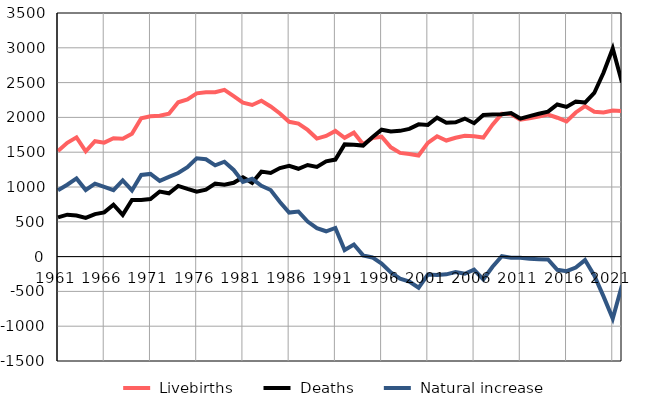
| Category |  Livebirths |  Deaths |  Natural increase |
|---|---|---|---|
| 1961.0 | 1517 | 563 | 954 |
| 1962.0 | 1634 | 602 | 1032 |
| 1963.0 | 1713 | 590 | 1123 |
| 1964.0 | 1512 | 555 | 957 |
| 1965.0 | 1658 | 610 | 1048 |
| 1966.0 | 1637 | 635 | 1002 |
| 1967.0 | 1700 | 745 | 955 |
| 1968.0 | 1694 | 600 | 1094 |
| 1969.0 | 1765 | 814 | 951 |
| 1970.0 | 1987 | 814 | 1173 |
| 1971.0 | 2015 | 827 | 1188 |
| 1972.0 | 2023 | 935 | 1088 |
| 1973.0 | 2054 | 909 | 1145 |
| 1974.0 | 2217 | 1016 | 1201 |
| 1975.0 | 2257 | 972 | 1285 |
| 1976.0 | 2345 | 933 | 1412 |
| 1977.0 | 2361 | 962 | 1399 |
| 1978.0 | 2361 | 1050 | 1311 |
| 1979.0 | 2395 | 1032 | 1363 |
| 1980.0 | 2305 | 1060 | 1245 |
| 1981.0 | 2212 | 1140 | 1072 |
| 1982.0 | 2178 | 1060 | 1118 |
| 1983.0 | 2239 | 1221 | 1018 |
| 1984.0 | 2157 | 1201 | 956 |
| 1985.0 | 2057 | 1272 | 785 |
| 1986.0 | 1937 | 1304 | 633 |
| 1987.0 | 1910 | 1262 | 648 |
| 1988.0 | 1820 | 1316 | 504 |
| 1989.0 | 1696 | 1288 | 408 |
| 1990.0 | 1733 | 1369 | 364 |
| 1991.0 | 1806 | 1394 | 412 |
| 1992.0 | 1707 | 1612 | 95 |
| 1993.0 | 1781 | 1607 | 174 |
| 1994.0 | 1613 | 1595 | 18 |
| 1995.0 | 1702 | 1714 | -12 |
| 1996.0 | 1723 | 1823 | -100 |
| 1997.0 | 1570 | 1799 | -229 |
| 1998.0 | 1490 | 1807 | -317 |
| 1999.0 | 1475 | 1835 | -360 |
| 2000.0 | 1452 | 1900 | -448 |
| 2001.0 | 1634 | 1892 | -258 |
| 2002.0 | 1729 | 1995 | -266 |
| 2003.0 | 1668 | 1923 | -255 |
| 2004.0 | 1708 | 1930 | -222 |
| 2005.0 | 1736 | 1983 | -247 |
| 2006.0 | 1728 | 1917 | -189 |
| 2007.0 | 1710 | 2036 | -326 |
| 2008.0 | 1896 | 2041 | -145 |
| 2009.0 | 2051 | 2045 | 6 |
| 2010.0 | 2045 | 2062 | -17 |
| 2011.0 | 1968 | 1983 | -15 |
| 2012.0 | 1986 | 2018 | -32 |
| 2013.0 | 2014 | 2052 | -38 |
| 2014.0 | 2041 | 2083 | -42 |
| 2015.0 | 1995 | 2185 | -190 |
| 2016.0 | 1942 | 2151 | -209 |
| 2017.0 | 2071 | 2228 | -157 |
| 2018.0 | 2163 | 2213 | -50 |
| 2019.0 | 2081 | 2351 | -270 |
| 2020.0 | 2071 | 2642 | -571 |
| 2021.0 | 2100 | 2990 | -890 |
| 2022.0 | 2091 | 2502 | -411 |